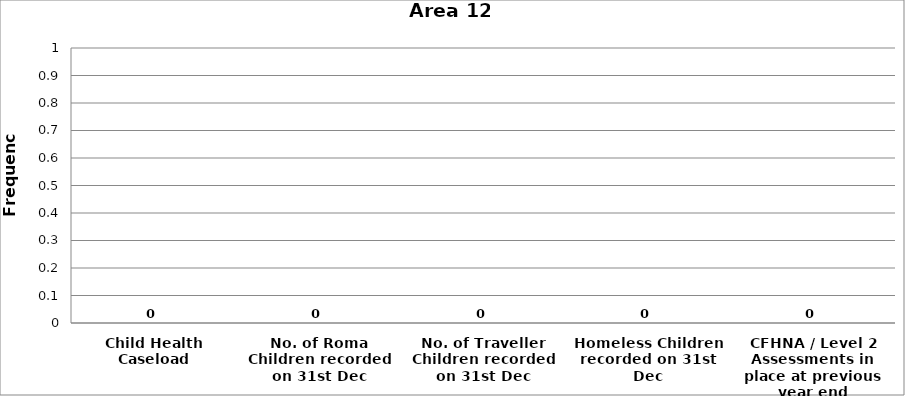
| Category | Area 12 |
|---|---|
| Child Health Caseload | 0 |
| No. of Roma Children recorded on 31st Dec | 0 |
| No. of Traveller Children recorded on 31st Dec | 0 |
| Homeless Children recorded on 31st Dec | 0 |
| CFHNA / Level 2 Assessments in place at previous year end | 0 |